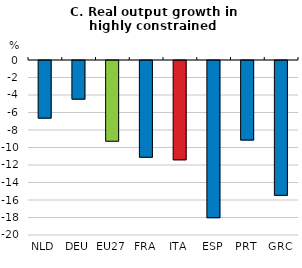
| Category | Real output growth in highly constrained sectors |
|---|---|
| NLD | -6.586 |
| DEU | -4.418 |
| EU27 | -9.226 |
| FRA | -11.06 |
| ITA | -11.355 |
| ESP | -17.965 |
| PRT | -9.096 |
| GRC | -15.408 |